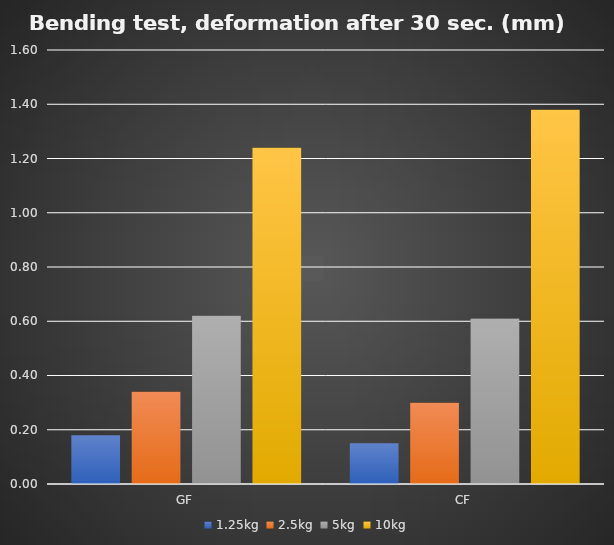
| Category | 1.25kg | 2.5kg | 5kg | 10kg |
|---|---|---|---|---|
| GF | 0.18 | 0.34 | 0.62 | 1.24 |
| CF | 0.15 | 0.3 | 0.61 | 1.38 |